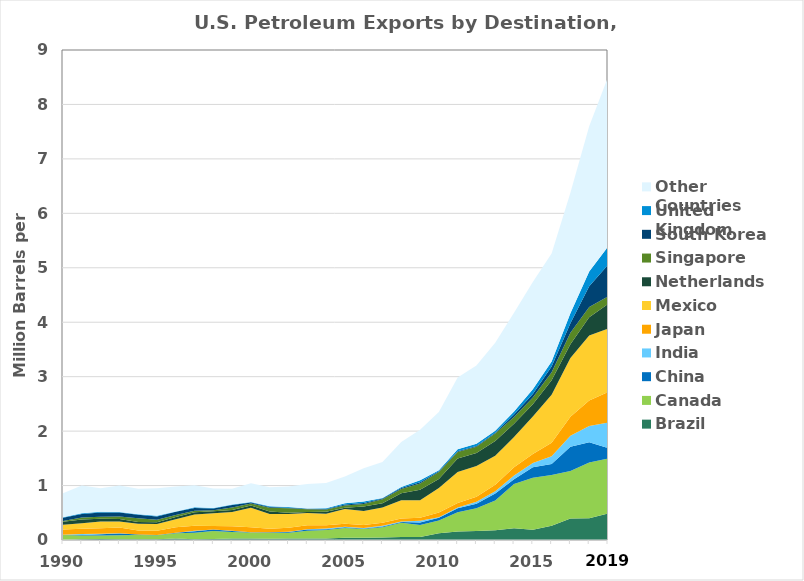
| Category | Brazil | Canada | China | India | Japan | Mexico | Netherlands | Singapore | South Korea | United Kingdom | Other Countries |
|---|---|---|---|---|---|---|---|---|---|---|---|
| 1990.0 | 0.002 | 0.091 | 0 | 0.006 | 0.092 | 0.089 | 0.054 | 0.015 | 0.06 | 0.011 | 0.438 |
| 1991.0 | 0.013 | 0.07 | 0.006 | 0.022 | 0.095 | 0.099 | 0.072 | 0.034 | 0.066 | 0.013 | 0.51 |
| 1992.0 | 0.02 | 0.064 | 0.023 | 0.007 | 0.1 | 0.124 | 0.052 | 0.038 | 0.08 | 0.012 | 0.431 |
| 1993.0 | 0.016 | 0.072 | 0.029 | 0.007 | 0.105 | 0.11 | 0.045 | 0.047 | 0.074 | 0.01 | 0.488 |
| 1994.0 | 0.015 | 0.078 | 0.007 | 0.001 | 0.074 | 0.124 | 0.03 | 0.068 | 0.066 | 0.01 | 0.469 |
| 1995.0 | 0.016 | 0.073 | 0.002 | 0.003 | 0.076 | 0.125 | 0.033 | 0.046 | 0.057 | 0.014 | 0.505 |
| 1996.0 | 0.029 | 0.094 | 0.008 | 0.003 | 0.102 | 0.143 | 0.043 | 0.034 | 0.06 | 0.009 | 0.455 |
| 1997.0 | 0.015 | 0.119 | 0.026 | 0.007 | 0.095 | 0.207 | 0.041 | 0.027 | 0.05 | 0.012 | 0.403 |
| 1998.0 | 0.018 | 0.148 | 0.026 | 0.002 | 0.064 | 0.235 | 0.033 | 0.019 | 0.033 | 0.011 | 0.356 |
| 1999.0 | 0.027 | 0.119 | 0.019 | 0.003 | 0.084 | 0.261 | 0.038 | 0.045 | 0.049 | 0.009 | 0.286 |
| 2000.0 | 0.028 | 0.11 | 0.003 | 0.003 | 0.09 | 0.358 | 0.042 | 0.036 | 0.02 | 0.01 | 0.342 |
| 2001.0 | 0.023 | 0.112 | 0.006 | 0.003 | 0.062 | 0.274 | 0.045 | 0.067 | 0.014 | 0.013 | 0.352 |
| 2002.0 | 0.026 | 0.106 | 0.014 | 0.003 | 0.074 | 0.254 | 0.023 | 0.081 | 0.011 | 0.012 | 0.38 |
| 2003.0 | 0.027 | 0.141 | 0.024 | 0.007 | 0.069 | 0.228 | 0.015 | 0.051 | 0.01 | 0.006 | 0.447 |
| 2004.0 | 0.027 | 0.158 | 0.013 | 0.011 | 0.063 | 0.209 | 0.036 | 0.041 | 0.012 | 0.014 | 0.464 |
| 2005.0 | 0.039 | 0.181 | 0.012 | 0.011 | 0.056 | 0.268 | 0.025 | 0.043 | 0.016 | 0.021 | 0.492 |
| 2006.0 | 0.042 | 0.159 | 0.011 | 0.008 | 0.058 | 0.255 | 0.083 | 0.045 | 0.021 | 0.028 | 0.607 |
| 2007.0 | 0.046 | 0.189 | 0.014 | 0.014 | 0.054 | 0.279 | 0.081 | 0.071 | 0.016 | 0.009 | 0.66 |
| 2008.0 | 0.054 | 0.264 | 0.013 | 0.01 | 0.054 | 0.333 | 0.131 | 0.077 | 0.018 | 0.017 | 0.83 |
| 2009.0 | 0.055 | 0.223 | 0.044 | 0.03 | 0.058 | 0.322 | 0.192 | 0.115 | 0.023 | 0.033 | 0.928 |
| 2010.0 | 0.123 | 0.233 | 0.052 | 0.01 | 0.088 | 0.448 | 0.165 | 0.128 | 0.013 | 0.019 | 1.073 |
| 2011.0 | 0.157 | 0.351 | 0.073 | 0.017 | 0.079 | 0.57 | 0.248 | 0.121 | 0.015 | 0.035 | 1.32 |
| 2012.0 | 0.166 | 0.416 | 0.085 | 0.036 | 0.089 | 0.565 | 0.239 | 0.115 | 0.016 | 0.041 | 1.435 |
| 2013.0 | 0.179 | 0.549 | 0.129 | 0.041 | 0.117 | 0.532 | 0.274 | 0.136 | 0.013 | 0.036 | 1.616 |
| 2014.0 | 0.217 | 0.809 | 0.089 | 0.07 | 0.15 | 0.559 | 0.241 | 0.124 | 0.046 | 0.053 | 1.817 |
| 2015.0 | 0.188 | 0.955 | 0.191 | 0.078 | 0.166 | 0.69 | 0.226 | 0.122 | 0.065 | 0.089 | 1.968 |
| 2016.0 | 0.26 | 0.935 | 0.203 | 0.14 | 0.25 | 0.88 | 0.265 | 0.147 | 0.108 | 0.092 | 1.98 |
| 2017.0 | 0.395 | 0.871 | 0.447 | 0.2 | 0.35 | 1.081 | 0.251 | 0.21 | 0.176 | 0.186 | 2.209 |
| 2018.0 | 0.4 | 1.024 | 0.374 | 0.297 | 0.466 | 1.194 | 0.337 | 0.185 | 0.382 | 0.272 | 2.67 |
| 2019.0 | 0.487 | 1.009 | 0.194 | 0.468 | 0.561 | 1.162 | 0.452 | 0.139 | 0.582 | 0.335 | 3.111 |